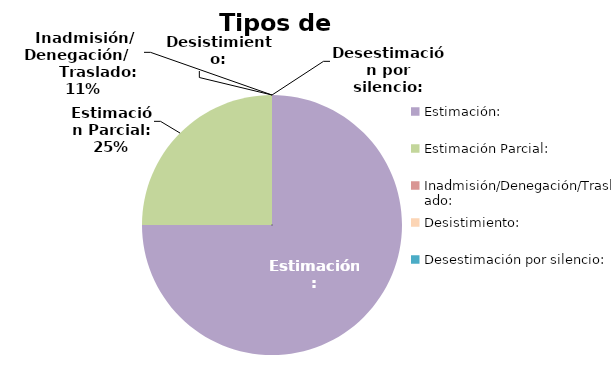
| Category | Tipos de resolución |
|---|---|
| Estimación: | 3 |
| Estimación Parcial: | 1 |
| Inadmisión/Denegación/Traslado: | 0 |
| Desistimiento: | 0 |
| Desestimación por silencio: | 0 |